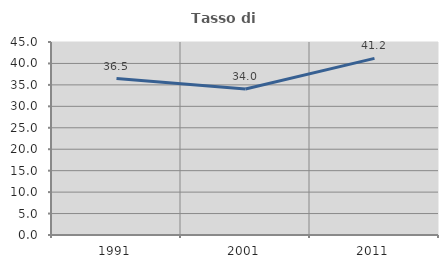
| Category | Tasso di occupazione   |
|---|---|
| 1991.0 | 36.485 |
| 2001.0 | 34.038 |
| 2011.0 | 41.186 |